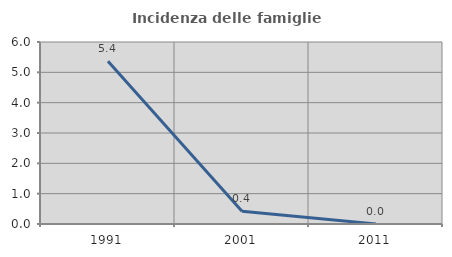
| Category | Incidenza delle famiglie numerose |
|---|---|
| 1991.0 | 5.366 |
| 2001.0 | 0.422 |
| 2011.0 | 0 |